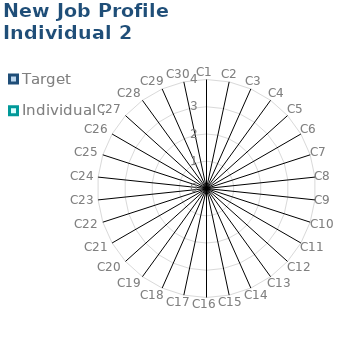
| Category | Target | Individual 2 |
|---|---|---|
| C1 | 0 | 0 |
| C2 | 0 | 0 |
| C3 | 0 | 0 |
| C4 | 0 | 0 |
| C5 | 0 | 0 |
| C6 | 0 | 0 |
| C7 | 0 | 0 |
| C8 | 0 | 0 |
| C9 | 0 | 0 |
| C10 | 0 | 0 |
| C11 | 0 | 0 |
| C12 | 0 | 0 |
| C13 | 0 | 0 |
| C14 | 0 | 0 |
| C15 | 0 | 0 |
| C16 | 0 | 0 |
| C17 | 0 | 0 |
| C18 | 0 | 0 |
| C19 | 0 | 0 |
| C20 | 0 | 0 |
| C21 | 0 | 0 |
| C22 | 0 | 0 |
| C23 | 0 | 0 |
| C24 | 0 | 0 |
| C25 | 0 | 0 |
| C26 | 0 | 0 |
| C27 | 0 | 0 |
| C28 | 0 | 0 |
| C29 | 0 | 0 |
| C30 | 0 | 0 |